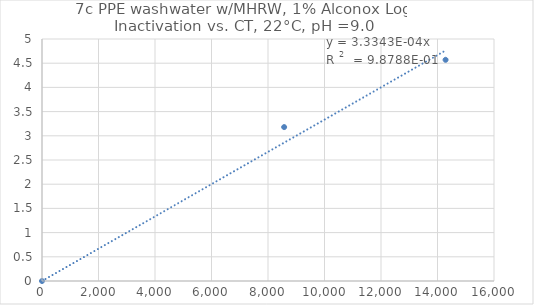
| Category | Series 0 |
|---|---|
| 0.0 | 0 |
| 8571.428571428572 | 3.18 |
| 14285.714285714286 | 4.57 |